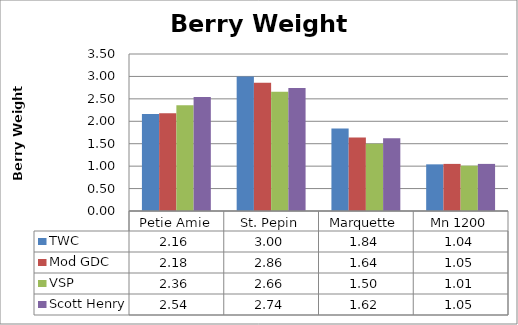
| Category | TWC | Mod GDC | VSP | Scott Henry |
|---|---|---|---|---|
| 0 | 2.16 | 2.18 | 2.36 | 2.54 |
| 1 | 3 | 2.86 | 2.66 | 2.74 |
| 2 | 1.84 | 1.64 | 1.5 | 1.62 |
| 3 | 1.04 | 1.05 | 1.01 | 1.05 |